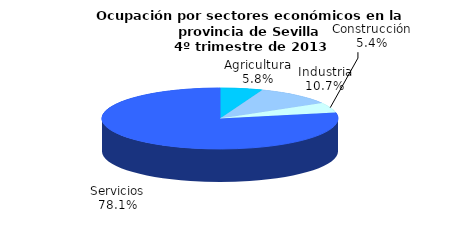
| Category | Series 0 |
|---|---|
| Agricultura | 34.7 |
| Industria | 63.8 |
| Construcción | 31.9 |
| Servicios | 465.6 |